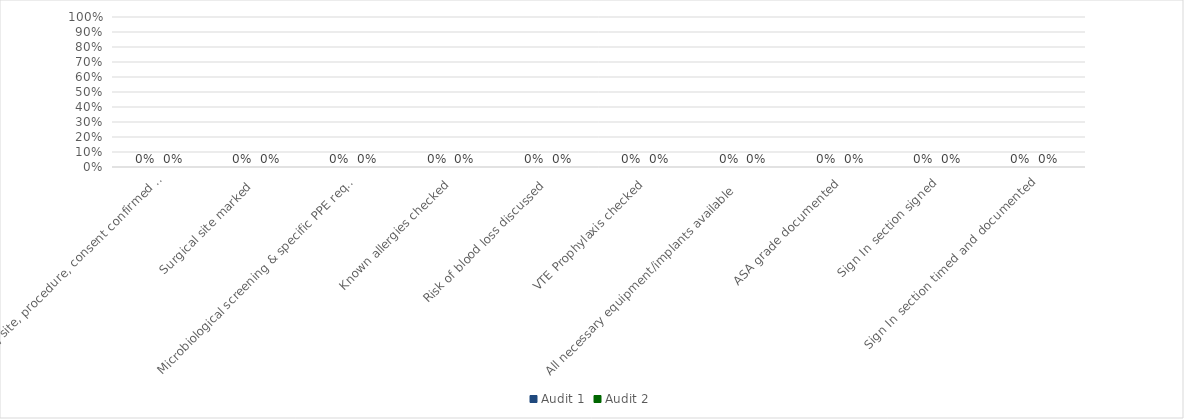
| Category | Audit 1 | Audit 2 |
|---|---|---|
| Identity, site, procedure, consent confirmed with patient  | 0 | 0 |
| Surgical site marked  | 0 | 0 |
| Microbiological screening & specific PPE requirement checked | 0 | 0 |
| Known allergies checked | 0 | 0 |
| Risk of blood loss discussed | 0 | 0 |
| VTE Prophylaxis checked | 0 | 0 |
| All necessary equipment/implants available   | 0 | 0 |
| ASA grade documented | 0 | 0 |
| Sign In section signed | 0 | 0 |
| Sign In section timed and documented | 0 | 0 |